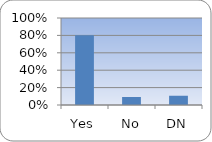
| Category | Series 0 |
|---|---|
| Yes | 0.802 |
| No | 0.092 |
| DN | 0.106 |